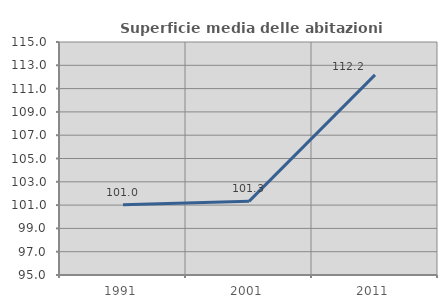
| Category | Superficie media delle abitazioni occupate |
|---|---|
| 1991.0 | 101.032 |
| 2001.0 | 101.325 |
| 2011.0 | 112.175 |